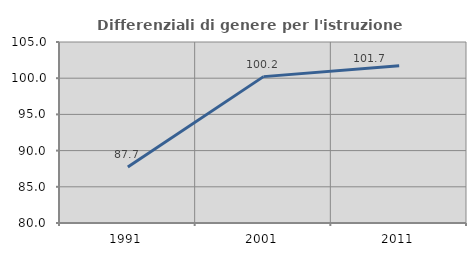
| Category | Differenziali di genere per l'istruzione superiore |
|---|---|
| 1991.0 | 87.742 |
| 2001.0 | 100.217 |
| 2011.0 | 101.721 |